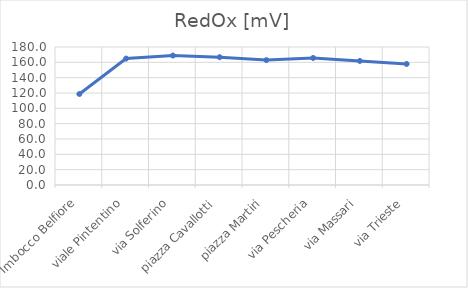
| Category | RedOx [mV] |
|---|---|
| Imbocco Belfiore | 118.7 |
| viale Pintentino | 164.9 |
| via Solferino | 168.9 |
| piazza Cavallotti | 166.7 |
| piazza Martiri | 162.9 |
| via Pescheria | 165.7 |
| via Massari | 161.8 |
| via Trieste | 157.9 |